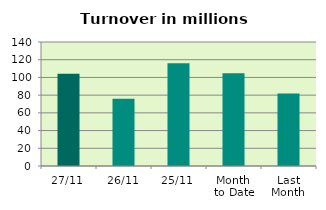
| Category | Series 0 |
|---|---|
| 27/11 | 104.249 |
| 26/11 | 75.95 |
| 25/11 | 115.896 |
| Month 
to Date | 104.813 |
| Last
Month | 81.795 |